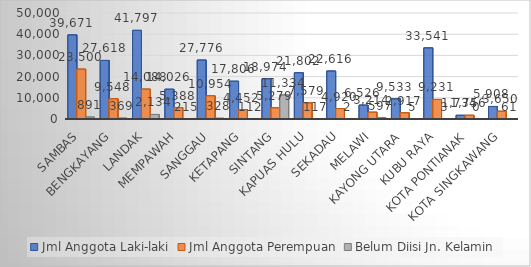
| Category | Jml Anggota Laki-laki | Jml Anggota Perempuan | Belum Diisi Jn. Kelamin |
|---|---|---|---|
| Sambas | 39671 | 23500 | 891 |
| Bengkayang | 27618 | 9548 | 369 |
| Landak | 41797 | 14088 | 2134 |
| Mempawah | 14026 | 5388 | 215 |
| Sanggau | 27776 | 10954 | 328 |
| Ketapang | 17806 | 4452 | 112 |
| Sintang | 18974 | 5279 | 11334 |
| Kapuas Hulu | 21802 | 7579 | 117 |
| Sekadau | 22616 | 4920 | 2 |
| Melawi | 6526 | 3214 | 597 |
| Kayong Utara | 9533 | 2917 | 5 |
| Kubu Raya | 33541 | 9231 | 3 |
| Kota Pontianak | 1734 | 1756 | 0 |
| Kota Singkawang | 5908 | 3650 | 61 |